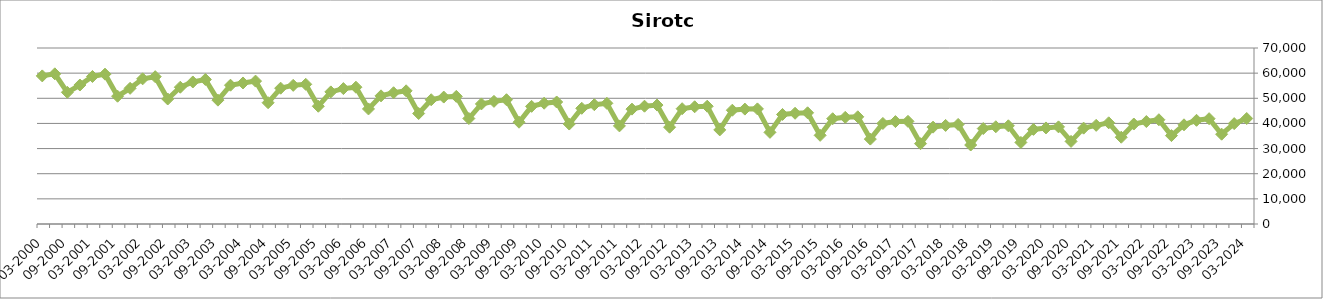
| Category | sirotci |
|---|---|
| 03-2024 | 41960 |
| 12-2023 | 39928 |
| 09-2023 | 35717 |
| 06-2023 | 41891 |
| 03-2023 | 41242 |
| 12-2022 | 39451 |
| 09-2022 | 35157 |
| 06-2022 | 41468 |
| 03-2022 | 40744 |
| 12-2021 | 39765 |
| 09-2021 | 34514 |
| 06-2021 | 40249 |
| 03-2021 | 39242 |
| 12-2020 | 38127 |
| 09-2020 | 32854 |
| 06-2020 | 38635 |
| 03-2020 | 38206 |
| 12-2019 | 37627 |
| 09-2019 | 32440 |
| 06-2019 | 39055 |
| 03-2019 | 38677 |
| 12-2018 | 37967 |
| 09-2018 | 31419 |
| 06-2018 | 39594 |
| 03-2018 | 39211 |
| 12-2017 | 38522 |
| 09-2017 | 31954 |
| 06-2017 | 40830 |
| 03-2017 | 40731 |
| 12-2016 | 39995 |
| 09-2016 | 33771 |
| 06-2016 | 42640 |
| 03-2016 | 42414 |
| 12-2015 | 41870 |
| 09-2015 | 35264 |
| 06-2015 | 44228 |
| 03-2015 | 44048 |
| 12-2014 | 43563 |
| 09-2014 | 36452 |
| 06-2014 | 45780 |
| 03-2014 | 45697 |
| 12-2013 | 45258 |
| 09-2013 | 37423 |
| 06-2013 | 46841 |
| 03-2013 | 46622 |
| 12-2012 | 45856 |
| 09-2012 | 38500 |
| 06-2012 | 47315 |
| 03-2012 | 46849 |
| 12-2011 | 45693 |
| 09-2011 | 39020 |
| 06-2011 | 47996 |
| 03-2011 | 47451 |
| 12-2010 | 46021 |
| 09-2010 | 39757 |
| 06-2010 | 48528 |
| 03-2010 | 48041 |
| 12-2009 | 46798 |
| 09-2009 | 40484 |
| 06-2009 | 49425 |
| 03-2009 | 48772 |
| 12-2008 | 47754 |
| 09-2008 | 41957 |
| 06-2008 | 50758 |
| 03-2008 | 50485 |
| 12-2007 | 49415 |
| 09-2007 | 43944 |
| 06-2007 | 52971 |
| 03-2007 | 52204 |
| 12-2006 | 50968 |
| 09-2006 | 45763 |
| 06-2006 | 54412 |
| 03-2006 | 53852 |
| 12-2005 | 52543 |
| 09-2005 | 46836 |
| 06-2005 | 55555 |
| 03-2005 | 55144 |
| 12-2004 | 54020 |
| 09-2004 | 48243 |
| 06-2004 | 56837 |
| 03-2004 | 56088 |
| 12-2003 | 55202 |
| 09-2003 | 49259 |
| 06-2003 | 57486 |
| 03-2003 | 56488 |
| 12-2002 | 54401 |
| 09-2002 | 49713 |
| 06-2002 | 58593 |
| 03-2002 | 57741 |
| 12-2001 | 53961 |
| 09-2001 | 50825 |
| 06-2001 | 59603 |
| 03-2001 | 58675 |
| 12-2000 | 55273 |
| 09-2000 | 52378 |
| 06-2000 | 59729 |
| 03-2000 | 58907 |